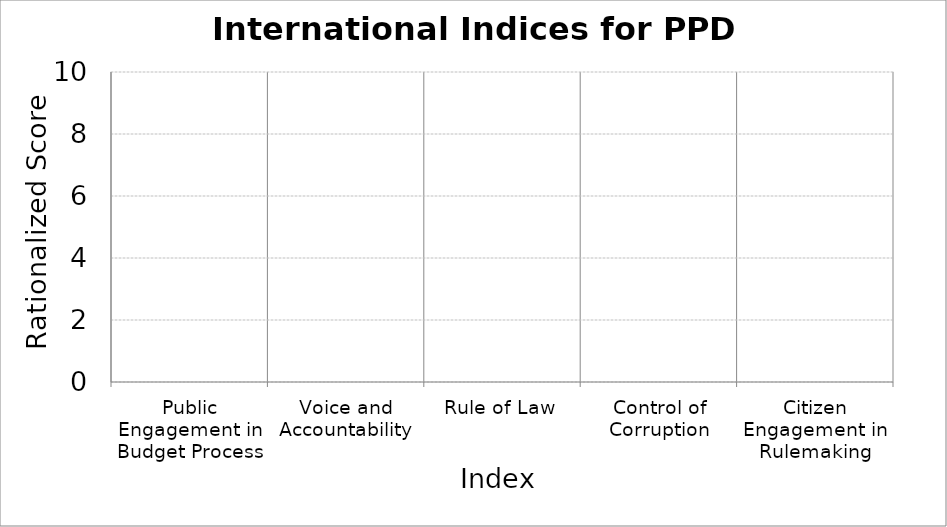
| Category | International Indices |
|---|---|
| Public Engagement in Budget Process | 0 |
| Voice and Accountability | 0 |
| Rule of Law | 0 |
| Control of Corruption | 0 |
| Citizen Engagement in Rulemaking | 0 |